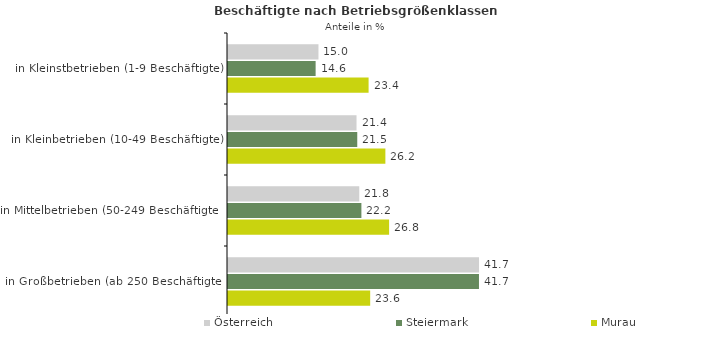
| Category | Österreich | Steiermark | Murau |
|---|---|---|---|
| in Kleinstbetrieben (1-9 Beschäftigte) | 15.046 | 14.574 | 23.384 |
| in Kleinbetrieben (10-49 Beschäftigte) | 21.375 | 21.498 | 26.174 |
| in Mittelbetrieben (50-249 Beschäftigte) | 21.831 | 22.187 | 26.795 |
| in Großbetrieben (ab 250 Beschäftigte) | 41.748 | 41.742 | 23.647 |